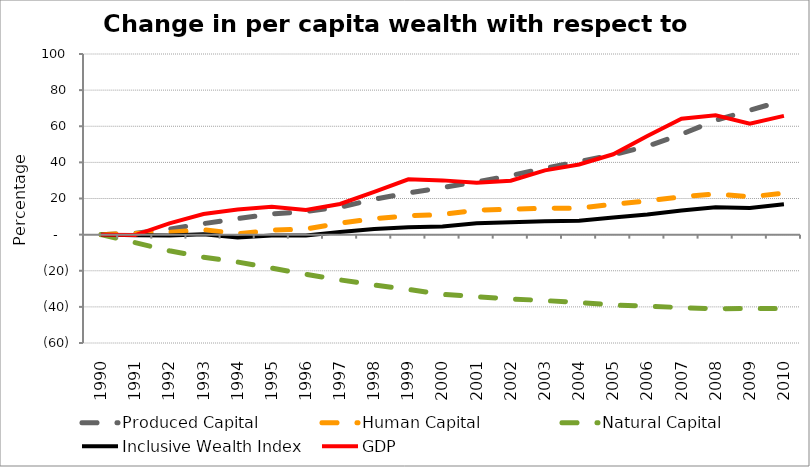
| Category | Produced Capital  | Human Capital | Natural Capital | Inclusive Wealth Index | GDP |
|---|---|---|---|---|---|
| 1990.0 | 0 | 0 | 0 | 0 | 0 |
| 1991.0 | 0.747 | 0.654 | -4.435 | -0.302 | -0.246 |
| 1992.0 | 3.058 | 1.236 | -8.957 | -0.489 | 6.27 |
| 1993.0 | 6.075 | 2.716 | -12.487 | 0.218 | 11.434 |
| 1994.0 | 8.859 | 0.416 | -15.177 | -1.563 | 13.908 |
| 1995.0 | 11.436 | 2.42 | -18.542 | -0.514 | 15.493 |
| 1996.0 | 12.842 | 3.095 | -21.975 | -0.534 | 13.629 |
| 1997.0 | 15.191 | 6.386 | -25.043 | 1.438 | 16.97 |
| 1998.0 | 19.566 | 8.885 | -27.891 | 3.14 | 23.663 |
| 1999.0 | 23.024 | 10.389 | -30.329 | 4.122 | 30.655 |
| 2000.0 | 26.079 | 11.174 | -33.06 | 4.503 | 30.033 |
| 2001.0 | 29.167 | 13.558 | -34.383 | 6.265 | 28.682 |
| 2002.0 | 32.703 | 14.076 | -35.596 | 6.806 | 29.814 |
| 2003.0 | 36.75 | 14.592 | -36.509 | 7.462 | 35.563 |
| 2004.0 | 40.402 | 14.663 | -37.562 | 7.737 | 38.83 |
| 2005.0 | 44.213 | 16.854 | -38.959 | 9.435 | 44.484 |
| 2006.0 | 48.943 | 18.654 | -39.564 | 11.12 | 54.572 |
| 2007.0 | 55.566 | 20.972 | -40.418 | 13.337 | 64.185 |
| 2008.0 | 63.29 | 22.56 | -41.134 | 15.203 | 66.062 |
| 2009.0 | 68.843 | 20.957 | -40.877 | 14.789 | 61.467 |
| 2010.0 | 74.31 | 22.922 | -40.99 | 16.768 | 65.744 |